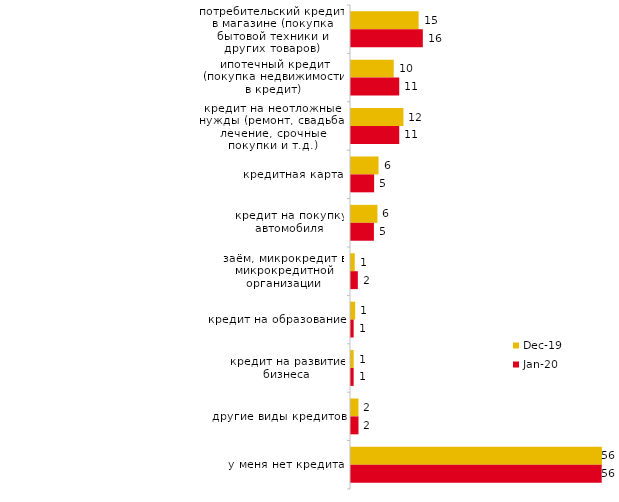
| Category | дек.19 | янв.20 |
|---|---|---|
| потребительский кредит в магазине (покупка бытовой техники и других товаров) | 15.198 | 16.139 |
| ипотечный кредит (покупка недвижимости в кредит) | 9.604 | 10.842 |
| кредит на неотложные нужды (ремонт, свадьба, лечение, срочные покупки и т.д.) | 11.782 | 10.842 |
| кредитная карта | 6.188 | 5.198 |
| кредит на покупку автомобиля | 5.941 | 5.149 |
| заём, микрокредит в микрокредитной организации | 0.842 | 1.535 |
| кредит на образование | 0.941 | 0.594 |
| кредит на развитие бизнеса | 0.594 | 0.594 |
| другие виды кредитов | 1.683 | 1.683 |
| у меня нет кредита | 56.386 | 56.337 |